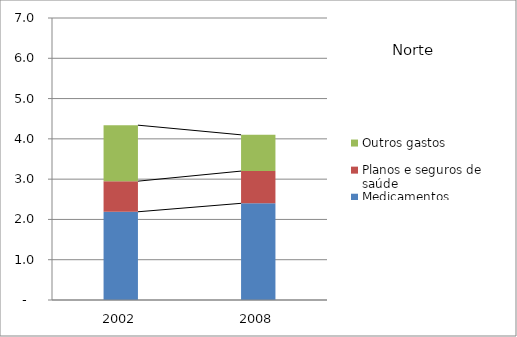
| Category | Medicamentos | Planos e seguros de saúde | Outros gastos |
|---|---|---|---|
| 2002.0 | 2.19 | 0.76 | 1.39 |
| 2008.0 | 2.4 | 0.8 | 0.9 |